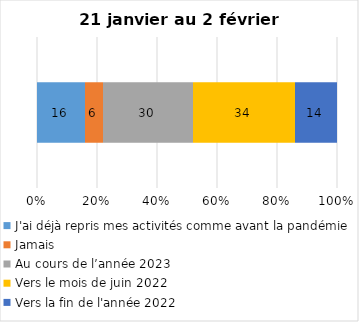
| Category | J'ai déjà repris mes activités comme avant la pandémie | Jamais | Au cours de l’année 2023 | Vers le mois de juin 2022 | Vers la fin de l'année 2022 |
|---|---|---|---|---|---|
| 0 | 16 | 6 | 30 | 34 | 14 |